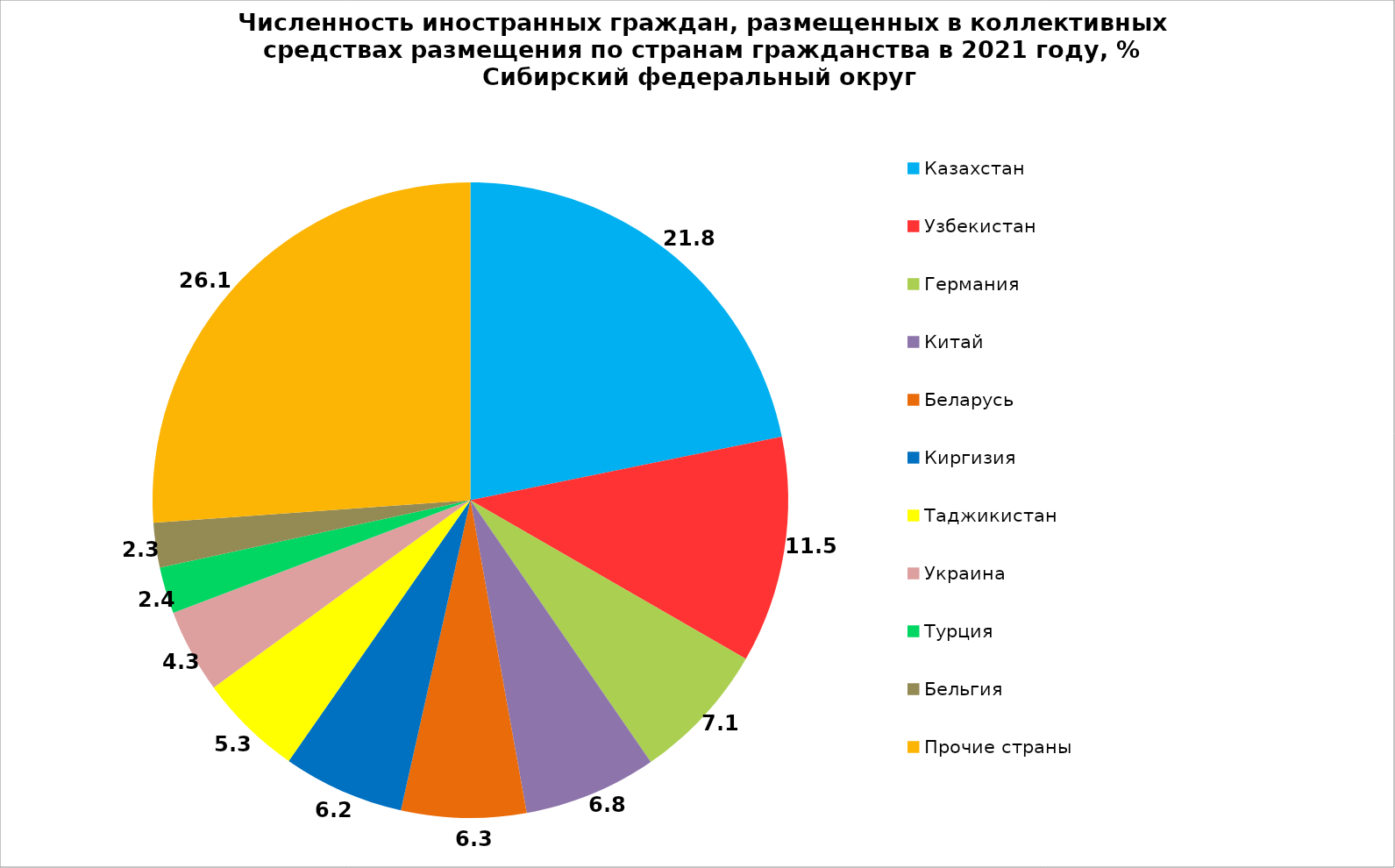
| Category | Series 0 |
|---|---|
| Казахстан | 21.791 |
| Узбекистан | 11.524 |
| Германия | 7.08 |
| Китай | 6.768 |
| Беларусь | 6.349 |
| Киргизия | 6.175 |
| Таджикистан | 5.28 |
| Украина | 4.261 |
| Турция | 2.368 |
| Бельгия | 2.272 |
| Прочие страны | 26.133 |